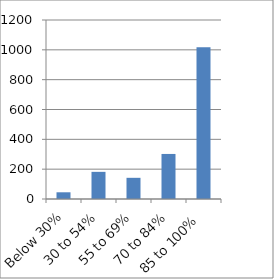
| Category | Series 0 |
|---|---|
| Below 30% | 45 |
| 30 to 54% | 182 |
|  55 to 69% | 142 |
| 70 to 84% | 302 |
| 85 to 100% | 1018 |